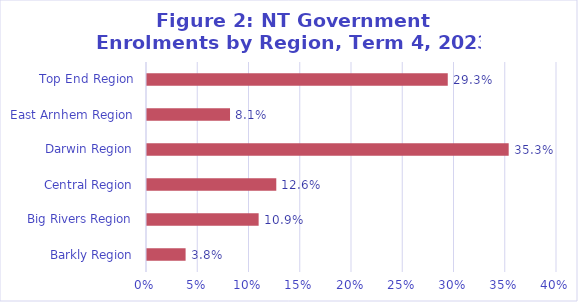
| Category | Series 0 |
|---|---|
| Barkly Region | 0.038 |
| Big Rivers Region | 0.109 |
| Central Region | 0.126 |
| Darwin Region | 0.353 |
| East Arnhem Region | 0.081 |
| Top End Region | 0.293 |